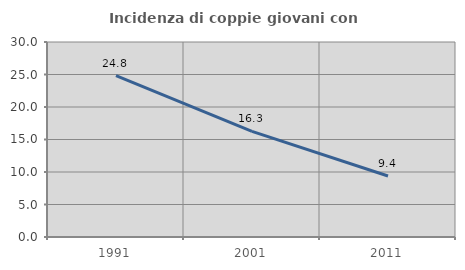
| Category | Incidenza di coppie giovani con figli |
|---|---|
| 1991.0 | 24.819 |
| 2001.0 | 16.259 |
| 2011.0 | 9.38 |